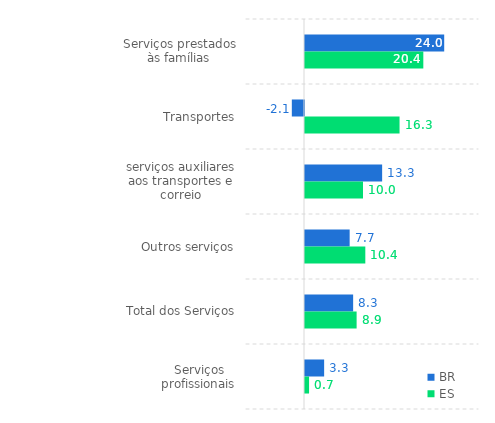
| Category | BR | ES |
|---|---|---|
| 0 | 24 | 20.4 |
| 1 | -2.1 | 16.3 |
| 2 | 13.3 | 10 |
| 3 | 7.7 | 10.4 |
| 4 | 8.3 | 8.9 |
| 5 | 3.3 | 0.7 |